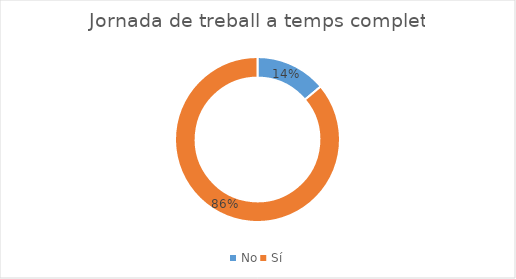
| Category | Series 0 |
|---|---|
| No | 5 |
| Sí | 31 |